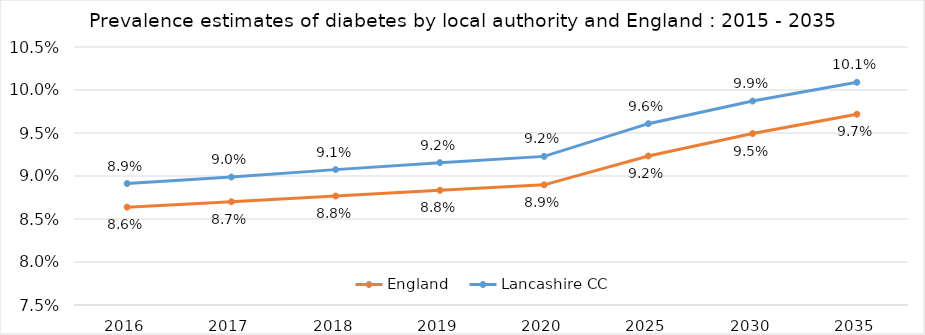
| Category | England | Lancashire CC |
|---|---|---|
| 2016.0 | 0.086 | 0.089 |
| 2017.0 | 0.087 | 0.09 |
| 2018.0 | 0.088 | 0.091 |
| 2019.0 | 0.088 | 0.092 |
| 2020.0 | 0.089 | 0.092 |
| 2025.0 | 0.092 | 0.096 |
| 2030.0 | 0.095 | 0.099 |
| 2035.0 | 0.097 | 0.101 |